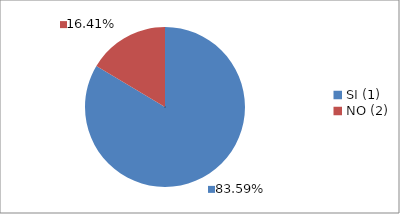
| Category | Series 0 |
|---|---|
| SI (1) | 0.836 |
| NO (2) | 0.164 |